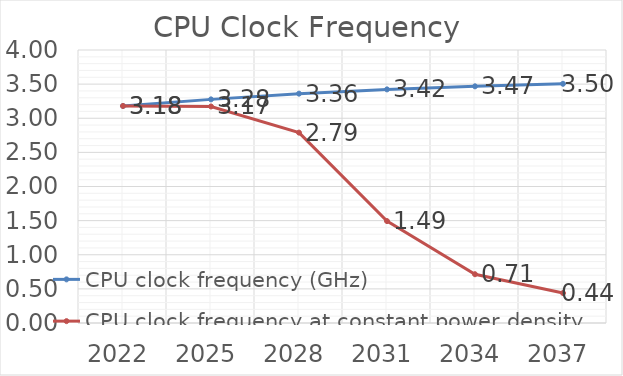
| Category | CPU clock frequency (GHz) | CPU clock frequency at constant power density (GHz) |
|---|---|---|
| 2022.0 | 3.18 | 3.18 |
| 2025.0 | 3.277 | 3.173 |
| 2028.0 | 3.36 | 2.79 |
| 2031.0 | 3.423 | 1.493 |
| 2034.0 | 3.468 | 0.714 |
| 2037.0 | 3.505 | 0.439 |